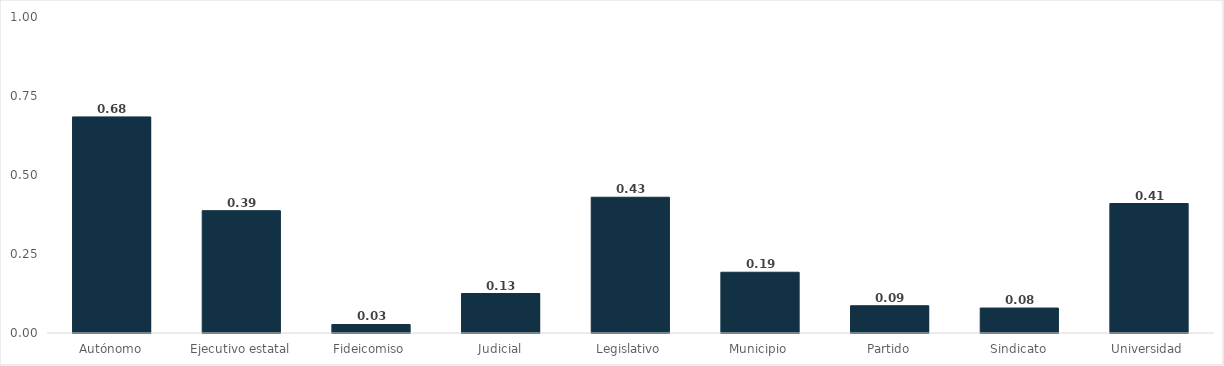
| Category | Total |
|---|---|
| Autónomo | 0.684 |
| Ejecutivo estatal | 0.387 |
| Fideicomiso | 0.027 |
| Judicial | 0.125 |
| Legislativo | 0.43 |
| Municipio | 0.192 |
| Partido | 0.086 |
| Sindicato | 0.079 |
| Universidad | 0.41 |